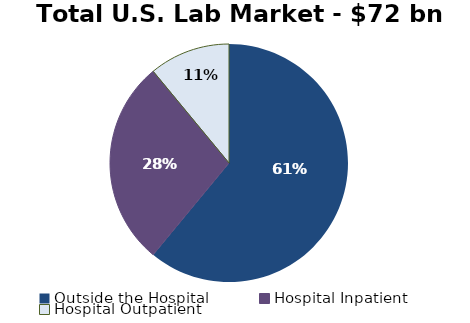
| Category | Series 0 |
|---|---|
| Outside the Hospital | 0.61 |
| Hospital Inpatient | 0.28 |
| Hospital Outpatient | 0.11 |